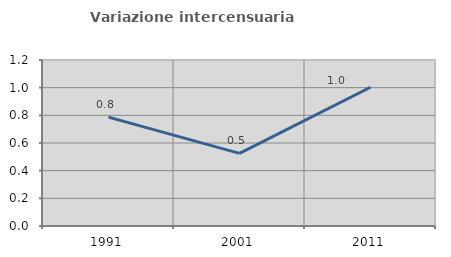
| Category | Variazione intercensuaria annua |
|---|---|
| 1991.0 | 0.787 |
| 2001.0 | 0.525 |
| 2011.0 | 1.003 |